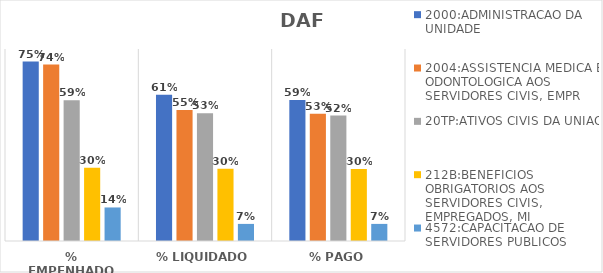
| Category | 2000:ADMINISTRACAO DA UNIDADE | 2004:ASSISTENCIA MEDICA E ODONTOLOGICA AOS SERVIDORES CIVIS, EMPR | 20TP:ATIVOS CIVIS DA UNIAO | 212B:BENEFICIOS OBRIGATORIOS AOS SERVIDORES CIVIS, EMPREGADOS, MI | 4572:CAPACITACAO DE SERVIDORES PUBLICOS FEDERAIS EM PROCESSO DE Q |
|---|---|---|---|---|---|
| % EMPENHADO | 0.748 | 0.735 | 0.587 | 0.305 | 0.14 |
| % LIQUIDADO | 0.609 | 0.546 | 0.532 | 0.301 | 0.071 |
| % PAGO | 0.587 | 0.53 | 0.522 | 0.3 | 0.071 |